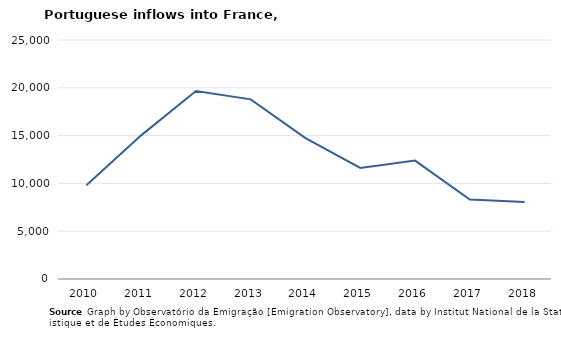
| Category | Entradas |
|---|---|
| 2010.0 | 9801 |
| 2011.0 | 15023 |
| 2012.0 | 19658 |
| 2013.0 | 18792 |
| 2014.0 | 14733 |
| 2015.0 | 11617 |
| 2016.0 | 12384 |
| 2017.0 | 8316 |
| 2018.0 | 8055 |